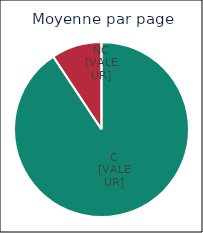
| Category | Series 0 |
|---|---|
| 0 | 0.907 |
| 1 | 0.093 |